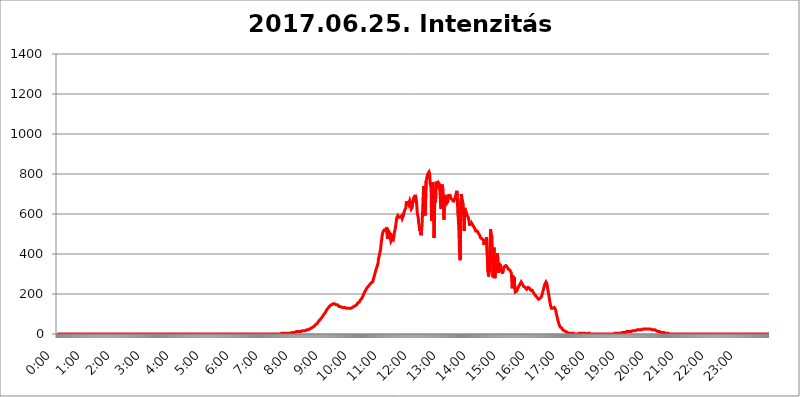
| Category | 2017.06.25. Intenzitás [W/m^2]04 |
|---|---|
| 0.0 | 0 |
| 0.0006944444444444445 | 0 |
| 0.001388888888888889 | 0 |
| 0.0020833333333333333 | 0 |
| 0.002777777777777778 | 0 |
| 0.003472222222222222 | 0 |
| 0.004166666666666667 | 0 |
| 0.004861111111111111 | 0 |
| 0.005555555555555556 | 0 |
| 0.0062499999999999995 | 0 |
| 0.006944444444444444 | 0 |
| 0.007638888888888889 | 0 |
| 0.008333333333333333 | 0 |
| 0.009027777777777779 | 0 |
| 0.009722222222222222 | 0 |
| 0.010416666666666666 | 0 |
| 0.011111111111111112 | 0 |
| 0.011805555555555555 | 0 |
| 0.012499999999999999 | 0 |
| 0.013194444444444444 | 0 |
| 0.013888888888888888 | 0 |
| 0.014583333333333332 | 0 |
| 0.015277777777777777 | 0 |
| 0.015972222222222224 | 0 |
| 0.016666666666666666 | 0 |
| 0.017361111111111112 | 0 |
| 0.018055555555555557 | 0 |
| 0.01875 | 0 |
| 0.019444444444444445 | 0 |
| 0.02013888888888889 | 0 |
| 0.020833333333333332 | 0 |
| 0.02152777777777778 | 0 |
| 0.022222222222222223 | 0 |
| 0.02291666666666667 | 0 |
| 0.02361111111111111 | 0 |
| 0.024305555555555556 | 0 |
| 0.024999999999999998 | 0 |
| 0.025694444444444447 | 0 |
| 0.02638888888888889 | 0 |
| 0.027083333333333334 | 0 |
| 0.027777777777777776 | 0 |
| 0.02847222222222222 | 0 |
| 0.029166666666666664 | 0 |
| 0.029861111111111113 | 0 |
| 0.030555555555555555 | 0 |
| 0.03125 | 0 |
| 0.03194444444444445 | 0 |
| 0.03263888888888889 | 0 |
| 0.03333333333333333 | 0 |
| 0.034027777777777775 | 0 |
| 0.034722222222222224 | 0 |
| 0.035416666666666666 | 0 |
| 0.036111111111111115 | 0 |
| 0.03680555555555556 | 0 |
| 0.0375 | 0 |
| 0.03819444444444444 | 0 |
| 0.03888888888888889 | 0 |
| 0.03958333333333333 | 0 |
| 0.04027777777777778 | 0 |
| 0.04097222222222222 | 0 |
| 0.041666666666666664 | 0 |
| 0.042361111111111106 | 0 |
| 0.04305555555555556 | 0 |
| 0.043750000000000004 | 0 |
| 0.044444444444444446 | 0 |
| 0.04513888888888889 | 0 |
| 0.04583333333333334 | 0 |
| 0.04652777777777778 | 0 |
| 0.04722222222222222 | 0 |
| 0.04791666666666666 | 0 |
| 0.04861111111111111 | 0 |
| 0.049305555555555554 | 0 |
| 0.049999999999999996 | 0 |
| 0.05069444444444445 | 0 |
| 0.051388888888888894 | 0 |
| 0.052083333333333336 | 0 |
| 0.05277777777777778 | 0 |
| 0.05347222222222222 | 0 |
| 0.05416666666666667 | 0 |
| 0.05486111111111111 | 0 |
| 0.05555555555555555 | 0 |
| 0.05625 | 0 |
| 0.05694444444444444 | 0 |
| 0.057638888888888885 | 0 |
| 0.05833333333333333 | 0 |
| 0.05902777777777778 | 0 |
| 0.059722222222222225 | 0 |
| 0.06041666666666667 | 0 |
| 0.061111111111111116 | 0 |
| 0.06180555555555556 | 0 |
| 0.0625 | 0 |
| 0.06319444444444444 | 0 |
| 0.06388888888888888 | 0 |
| 0.06458333333333334 | 0 |
| 0.06527777777777778 | 0 |
| 0.06597222222222222 | 0 |
| 0.06666666666666667 | 0 |
| 0.06736111111111111 | 0 |
| 0.06805555555555555 | 0 |
| 0.06874999999999999 | 0 |
| 0.06944444444444443 | 0 |
| 0.07013888888888889 | 0 |
| 0.07083333333333333 | 0 |
| 0.07152777777777779 | 0 |
| 0.07222222222222223 | 0 |
| 0.07291666666666667 | 0 |
| 0.07361111111111111 | 0 |
| 0.07430555555555556 | 0 |
| 0.075 | 0 |
| 0.07569444444444444 | 0 |
| 0.0763888888888889 | 0 |
| 0.07708333333333334 | 0 |
| 0.07777777777777778 | 0 |
| 0.07847222222222222 | 0 |
| 0.07916666666666666 | 0 |
| 0.0798611111111111 | 0 |
| 0.08055555555555556 | 0 |
| 0.08125 | 0 |
| 0.08194444444444444 | 0 |
| 0.08263888888888889 | 0 |
| 0.08333333333333333 | 0 |
| 0.08402777777777777 | 0 |
| 0.08472222222222221 | 0 |
| 0.08541666666666665 | 0 |
| 0.08611111111111112 | 0 |
| 0.08680555555555557 | 0 |
| 0.08750000000000001 | 0 |
| 0.08819444444444445 | 0 |
| 0.08888888888888889 | 0 |
| 0.08958333333333333 | 0 |
| 0.09027777777777778 | 0 |
| 0.09097222222222222 | 0 |
| 0.09166666666666667 | 0 |
| 0.09236111111111112 | 0 |
| 0.09305555555555556 | 0 |
| 0.09375 | 0 |
| 0.09444444444444444 | 0 |
| 0.09513888888888888 | 0 |
| 0.09583333333333333 | 0 |
| 0.09652777777777777 | 0 |
| 0.09722222222222222 | 0 |
| 0.09791666666666667 | 0 |
| 0.09861111111111111 | 0 |
| 0.09930555555555555 | 0 |
| 0.09999999999999999 | 0 |
| 0.10069444444444443 | 0 |
| 0.1013888888888889 | 0 |
| 0.10208333333333335 | 0 |
| 0.10277777777777779 | 0 |
| 0.10347222222222223 | 0 |
| 0.10416666666666667 | 0 |
| 0.10486111111111111 | 0 |
| 0.10555555555555556 | 0 |
| 0.10625 | 0 |
| 0.10694444444444444 | 0 |
| 0.1076388888888889 | 0 |
| 0.10833333333333334 | 0 |
| 0.10902777777777778 | 0 |
| 0.10972222222222222 | 0 |
| 0.1111111111111111 | 0 |
| 0.11180555555555556 | 0 |
| 0.11180555555555556 | 0 |
| 0.1125 | 0 |
| 0.11319444444444444 | 0 |
| 0.11388888888888889 | 0 |
| 0.11458333333333333 | 0 |
| 0.11527777777777777 | 0 |
| 0.11597222222222221 | 0 |
| 0.11666666666666665 | 0 |
| 0.1173611111111111 | 0 |
| 0.11805555555555557 | 0 |
| 0.11944444444444445 | 0 |
| 0.12013888888888889 | 0 |
| 0.12083333333333333 | 0 |
| 0.12152777777777778 | 0 |
| 0.12222222222222223 | 0 |
| 0.12291666666666667 | 0 |
| 0.12291666666666667 | 0 |
| 0.12361111111111112 | 0 |
| 0.12430555555555556 | 0 |
| 0.125 | 0 |
| 0.12569444444444444 | 0 |
| 0.12638888888888888 | 0 |
| 0.12708333333333333 | 0 |
| 0.16875 | 0 |
| 0.12847222222222224 | 0 |
| 0.12916666666666668 | 0 |
| 0.12986111111111112 | 0 |
| 0.13055555555555556 | 0 |
| 0.13125 | 0 |
| 0.13194444444444445 | 0 |
| 0.1326388888888889 | 0 |
| 0.13333333333333333 | 0 |
| 0.13402777777777777 | 0 |
| 0.13402777777777777 | 0 |
| 0.13472222222222222 | 0 |
| 0.13541666666666666 | 0 |
| 0.1361111111111111 | 0 |
| 0.13749999999999998 | 0 |
| 0.13819444444444443 | 0 |
| 0.1388888888888889 | 0 |
| 0.13958333333333334 | 0 |
| 0.14027777777777778 | 0 |
| 0.14097222222222222 | 0 |
| 0.14166666666666666 | 0 |
| 0.1423611111111111 | 0 |
| 0.14305555555555557 | 0 |
| 0.14375000000000002 | 0 |
| 0.14444444444444446 | 0 |
| 0.1451388888888889 | 0 |
| 0.1451388888888889 | 0 |
| 0.14652777777777778 | 0 |
| 0.14722222222222223 | 0 |
| 0.14791666666666667 | 0 |
| 0.1486111111111111 | 0 |
| 0.14930555555555555 | 0 |
| 0.15 | 0 |
| 0.15069444444444444 | 0 |
| 0.15138888888888888 | 0 |
| 0.15208333333333332 | 0 |
| 0.15277777777777776 | 0 |
| 0.15347222222222223 | 0 |
| 0.15416666666666667 | 0 |
| 0.15486111111111112 | 0 |
| 0.15555555555555556 | 0 |
| 0.15625 | 0 |
| 0.15694444444444444 | 0 |
| 0.15763888888888888 | 0 |
| 0.15833333333333333 | 0 |
| 0.15902777777777777 | 0 |
| 0.15972222222222224 | 0 |
| 0.16041666666666668 | 0 |
| 0.16111111111111112 | 0 |
| 0.16180555555555556 | 0 |
| 0.1625 | 0 |
| 0.16319444444444445 | 0 |
| 0.1638888888888889 | 0 |
| 0.16458333333333333 | 0 |
| 0.16527777777777777 | 0 |
| 0.16597222222222222 | 0 |
| 0.16666666666666666 | 0 |
| 0.1673611111111111 | 0 |
| 0.16805555555555554 | 0 |
| 0.16874999999999998 | 0 |
| 0.16944444444444443 | 0 |
| 0.17013888888888887 | 0 |
| 0.1708333333333333 | 0 |
| 0.17152777777777775 | 0 |
| 0.17222222222222225 | 0 |
| 0.1729166666666667 | 0 |
| 0.17361111111111113 | 0 |
| 0.17430555555555557 | 0 |
| 0.17500000000000002 | 0 |
| 0.17569444444444446 | 0 |
| 0.1763888888888889 | 0 |
| 0.17708333333333334 | 0 |
| 0.17777777777777778 | 0 |
| 0.17847222222222223 | 0 |
| 0.17916666666666667 | 0 |
| 0.1798611111111111 | 0 |
| 0.18055555555555555 | 0 |
| 0.18125 | 0 |
| 0.18194444444444444 | 0 |
| 0.1826388888888889 | 0 |
| 0.18333333333333335 | 0 |
| 0.1840277777777778 | 0 |
| 0.18472222222222223 | 0 |
| 0.18541666666666667 | 0 |
| 0.18611111111111112 | 0 |
| 0.18680555555555556 | 0 |
| 0.1875 | 0 |
| 0.18819444444444444 | 0 |
| 0.18888888888888888 | 0 |
| 0.18958333333333333 | 0 |
| 0.19027777777777777 | 0 |
| 0.1909722222222222 | 0 |
| 0.19166666666666665 | 0 |
| 0.19236111111111112 | 0 |
| 0.19305555555555554 | 0 |
| 0.19375 | 0 |
| 0.19444444444444445 | 0 |
| 0.1951388888888889 | 0 |
| 0.19583333333333333 | 0 |
| 0.19652777777777777 | 0 |
| 0.19722222222222222 | 0 |
| 0.19791666666666666 | 0 |
| 0.1986111111111111 | 0 |
| 0.19930555555555554 | 0 |
| 0.19999999999999998 | 0 |
| 0.20069444444444443 | 0 |
| 0.20138888888888887 | 0 |
| 0.2020833333333333 | 0 |
| 0.2027777777777778 | 0 |
| 0.2034722222222222 | 0 |
| 0.2041666666666667 | 0 |
| 0.20486111111111113 | 0 |
| 0.20555555555555557 | 0 |
| 0.20625000000000002 | 0 |
| 0.20694444444444446 | 0 |
| 0.2076388888888889 | 0 |
| 0.20833333333333334 | 0 |
| 0.20902777777777778 | 0 |
| 0.20972222222222223 | 0 |
| 0.21041666666666667 | 0 |
| 0.2111111111111111 | 0 |
| 0.21180555555555555 | 0 |
| 0.2125 | 0 |
| 0.21319444444444444 | 0 |
| 0.2138888888888889 | 0 |
| 0.21458333333333335 | 0 |
| 0.2152777777777778 | 0 |
| 0.21597222222222223 | 0 |
| 0.21666666666666667 | 0 |
| 0.21736111111111112 | 0 |
| 0.21805555555555556 | 0 |
| 0.21875 | 0 |
| 0.21944444444444444 | 0 |
| 0.22013888888888888 | 0 |
| 0.22083333333333333 | 0 |
| 0.22152777777777777 | 0 |
| 0.2222222222222222 | 0 |
| 0.22291666666666665 | 0 |
| 0.2236111111111111 | 0 |
| 0.22430555555555556 | 0 |
| 0.225 | 0 |
| 0.22569444444444445 | 0 |
| 0.2263888888888889 | 0 |
| 0.22708333333333333 | 0 |
| 0.22777777777777777 | 0 |
| 0.22847222222222222 | 0 |
| 0.22916666666666666 | 0 |
| 0.2298611111111111 | 0 |
| 0.23055555555555554 | 0 |
| 0.23124999999999998 | 0 |
| 0.23194444444444443 | 0 |
| 0.23263888888888887 | 0 |
| 0.2333333333333333 | 0 |
| 0.2340277777777778 | 0 |
| 0.2347222222222222 | 0 |
| 0.2354166666666667 | 0 |
| 0.23611111111111113 | 0 |
| 0.23680555555555557 | 0 |
| 0.23750000000000002 | 0 |
| 0.23819444444444446 | 0 |
| 0.2388888888888889 | 0 |
| 0.23958333333333334 | 0 |
| 0.24027777777777778 | 0 |
| 0.24097222222222223 | 0 |
| 0.24166666666666667 | 0 |
| 0.2423611111111111 | 0 |
| 0.24305555555555555 | 0 |
| 0.24375 | 0 |
| 0.24444444444444446 | 0 |
| 0.24513888888888888 | 0 |
| 0.24583333333333335 | 0 |
| 0.2465277777777778 | 0 |
| 0.24722222222222223 | 0 |
| 0.24791666666666667 | 0 |
| 0.24861111111111112 | 0 |
| 0.24930555555555556 | 0 |
| 0.25 | 0 |
| 0.25069444444444444 | 0 |
| 0.2513888888888889 | 0 |
| 0.2520833333333333 | 0 |
| 0.25277777777777777 | 0 |
| 0.2534722222222222 | 0 |
| 0.25416666666666665 | 0 |
| 0.2548611111111111 | 0 |
| 0.2555555555555556 | 0 |
| 0.25625000000000003 | 0 |
| 0.2569444444444445 | 0 |
| 0.2576388888888889 | 0 |
| 0.25833333333333336 | 0 |
| 0.2590277777777778 | 0 |
| 0.25972222222222224 | 0 |
| 0.2604166666666667 | 0 |
| 0.2611111111111111 | 0 |
| 0.26180555555555557 | 0 |
| 0.2625 | 0 |
| 0.26319444444444445 | 0 |
| 0.2638888888888889 | 0 |
| 0.26458333333333334 | 0 |
| 0.2652777777777778 | 0 |
| 0.2659722222222222 | 0 |
| 0.26666666666666666 | 0 |
| 0.2673611111111111 | 0 |
| 0.26805555555555555 | 0 |
| 0.26875 | 0 |
| 0.26944444444444443 | 0 |
| 0.2701388888888889 | 0 |
| 0.2708333333333333 | 0 |
| 0.27152777777777776 | 0 |
| 0.2722222222222222 | 0 |
| 0.27291666666666664 | 0 |
| 0.2736111111111111 | 0 |
| 0.2743055555555555 | 0 |
| 0.27499999999999997 | 0 |
| 0.27569444444444446 | 0 |
| 0.27638888888888885 | 0 |
| 0.27708333333333335 | 0 |
| 0.2777777777777778 | 0 |
| 0.27847222222222223 | 0 |
| 0.2791666666666667 | 0 |
| 0.2798611111111111 | 0 |
| 0.28055555555555556 | 0 |
| 0.28125 | 0 |
| 0.28194444444444444 | 0 |
| 0.2826388888888889 | 0 |
| 0.2833333333333333 | 0 |
| 0.28402777777777777 | 0 |
| 0.2847222222222222 | 0 |
| 0.28541666666666665 | 0 |
| 0.28611111111111115 | 0 |
| 0.28680555555555554 | 0 |
| 0.28750000000000003 | 0 |
| 0.2881944444444445 | 0 |
| 0.2888888888888889 | 0 |
| 0.28958333333333336 | 0 |
| 0.2902777777777778 | 0 |
| 0.29097222222222224 | 0 |
| 0.2916666666666667 | 0 |
| 0.2923611111111111 | 0 |
| 0.29305555555555557 | 0 |
| 0.29375 | 0 |
| 0.29444444444444445 | 0 |
| 0.2951388888888889 | 0 |
| 0.29583333333333334 | 0 |
| 0.2965277777777778 | 0 |
| 0.2972222222222222 | 0 |
| 0.29791666666666666 | 0 |
| 0.2986111111111111 | 0 |
| 0.29930555555555555 | 0 |
| 0.3 | 0 |
| 0.30069444444444443 | 0 |
| 0.3013888888888889 | 0 |
| 0.3020833333333333 | 0 |
| 0.30277777777777776 | 0 |
| 0.3034722222222222 | 0 |
| 0.30416666666666664 | 0 |
| 0.3048611111111111 | 0 |
| 0.3055555555555555 | 0 |
| 0.30624999999999997 | 0 |
| 0.3069444444444444 | 0 |
| 0.3076388888888889 | 0 |
| 0.30833333333333335 | 0 |
| 0.3090277777777778 | 0 |
| 0.30972222222222223 | 0 |
| 0.3104166666666667 | 0 |
| 0.3111111111111111 | 0 |
| 0.31180555555555556 | 0 |
| 0.3125 | 0 |
| 0.31319444444444444 | 0 |
| 0.3138888888888889 | 0 |
| 0.3145833333333333 | 3.525 |
| 0.31527777777777777 | 3.525 |
| 0.3159722222222222 | 0 |
| 0.31666666666666665 | 3.525 |
| 0.31736111111111115 | 3.525 |
| 0.31805555555555554 | 3.525 |
| 0.31875000000000003 | 3.525 |
| 0.3194444444444445 | 3.525 |
| 0.3201388888888889 | 3.525 |
| 0.32083333333333336 | 3.525 |
| 0.3215277777777778 | 3.525 |
| 0.32222222222222224 | 3.525 |
| 0.3229166666666667 | 3.525 |
| 0.3236111111111111 | 3.525 |
| 0.32430555555555557 | 3.525 |
| 0.325 | 3.525 |
| 0.32569444444444445 | 3.525 |
| 0.3263888888888889 | 3.525 |
| 0.32708333333333334 | 3.525 |
| 0.3277777777777778 | 3.525 |
| 0.3284722222222222 | 3.525 |
| 0.32916666666666666 | 7.887 |
| 0.3298611111111111 | 7.887 |
| 0.33055555555555555 | 7.887 |
| 0.33125 | 7.887 |
| 0.33194444444444443 | 7.887 |
| 0.3326388888888889 | 7.887 |
| 0.3333333333333333 | 7.887 |
| 0.3340277777777778 | 12.257 |
| 0.3347222222222222 | 12.257 |
| 0.3354166666666667 | 12.257 |
| 0.3361111111111111 | 12.257 |
| 0.3368055555555556 | 12.257 |
| 0.33749999999999997 | 12.257 |
| 0.33819444444444446 | 12.257 |
| 0.33888888888888885 | 12.257 |
| 0.33958333333333335 | 12.257 |
| 0.34027777777777773 | 12.257 |
| 0.34097222222222223 | 12.257 |
| 0.3416666666666666 | 12.257 |
| 0.3423611111111111 | 12.257 |
| 0.3430555555555555 | 12.257 |
| 0.34375 | 16.636 |
| 0.3444444444444445 | 16.636 |
| 0.3451388888888889 | 16.636 |
| 0.3458333333333334 | 16.636 |
| 0.34652777777777777 | 16.636 |
| 0.34722222222222227 | 16.636 |
| 0.34791666666666665 | 16.636 |
| 0.34861111111111115 | 16.636 |
| 0.34930555555555554 | 21.024 |
| 0.35000000000000003 | 21.024 |
| 0.3506944444444444 | 21.024 |
| 0.3513888888888889 | 21.024 |
| 0.3520833333333333 | 21.024 |
| 0.3527777777777778 | 21.024 |
| 0.3534722222222222 | 25.419 |
| 0.3541666666666667 | 25.419 |
| 0.3548611111111111 | 25.419 |
| 0.35555555555555557 | 25.419 |
| 0.35625 | 29.823 |
| 0.35694444444444445 | 29.823 |
| 0.3576388888888889 | 29.823 |
| 0.35833333333333334 | 34.234 |
| 0.3590277777777778 | 34.234 |
| 0.3597222222222222 | 38.653 |
| 0.36041666666666666 | 38.653 |
| 0.3611111111111111 | 38.653 |
| 0.36180555555555555 | 43.079 |
| 0.3625 | 47.511 |
| 0.36319444444444443 | 47.511 |
| 0.3638888888888889 | 51.951 |
| 0.3645833333333333 | 51.951 |
| 0.3652777777777778 | 56.398 |
| 0.3659722222222222 | 60.85 |
| 0.3666666666666667 | 65.31 |
| 0.3673611111111111 | 65.31 |
| 0.3680555555555556 | 69.775 |
| 0.36874999999999997 | 74.246 |
| 0.36944444444444446 | 74.246 |
| 0.37013888888888885 | 78.722 |
| 0.37083333333333335 | 83.205 |
| 0.37152777777777773 | 83.205 |
| 0.37222222222222223 | 87.692 |
| 0.3729166666666666 | 92.184 |
| 0.3736111111111111 | 96.682 |
| 0.3743055555555555 | 101.184 |
| 0.375 | 101.184 |
| 0.3756944444444445 | 105.69 |
| 0.3763888888888889 | 110.201 |
| 0.3770833333333334 | 114.716 |
| 0.37777777777777777 | 119.235 |
| 0.37847222222222227 | 123.758 |
| 0.37916666666666665 | 128.284 |
| 0.37986111111111115 | 128.284 |
| 0.38055555555555554 | 132.814 |
| 0.38125000000000003 | 137.347 |
| 0.3819444444444444 | 137.347 |
| 0.3826388888888889 | 141.884 |
| 0.3833333333333333 | 141.884 |
| 0.3840277777777778 | 146.423 |
| 0.3847222222222222 | 146.423 |
| 0.3854166666666667 | 146.423 |
| 0.3861111111111111 | 150.964 |
| 0.38680555555555557 | 150.964 |
| 0.3875 | 150.964 |
| 0.38819444444444445 | 150.964 |
| 0.3888888888888889 | 150.964 |
| 0.38958333333333334 | 150.964 |
| 0.3902777777777778 | 150.964 |
| 0.3909722222222222 | 146.423 |
| 0.39166666666666666 | 146.423 |
| 0.3923611111111111 | 146.423 |
| 0.39305555555555555 | 146.423 |
| 0.39375 | 141.884 |
| 0.39444444444444443 | 141.884 |
| 0.3951388888888889 | 137.347 |
| 0.3958333333333333 | 137.347 |
| 0.3965277777777778 | 137.347 |
| 0.3972222222222222 | 137.347 |
| 0.3979166666666667 | 132.814 |
| 0.3986111111111111 | 132.814 |
| 0.3993055555555556 | 132.814 |
| 0.39999999999999997 | 132.814 |
| 0.40069444444444446 | 132.814 |
| 0.40138888888888885 | 132.814 |
| 0.40208333333333335 | 132.814 |
| 0.40277777777777773 | 132.814 |
| 0.40347222222222223 | 132.814 |
| 0.4041666666666666 | 128.284 |
| 0.4048611111111111 | 128.284 |
| 0.4055555555555555 | 128.284 |
| 0.40625 | 128.284 |
| 0.4069444444444445 | 128.284 |
| 0.4076388888888889 | 128.284 |
| 0.4083333333333334 | 128.284 |
| 0.40902777777777777 | 128.284 |
| 0.40972222222222227 | 128.284 |
| 0.41041666666666665 | 128.284 |
| 0.41111111111111115 | 128.284 |
| 0.41180555555555554 | 128.284 |
| 0.41250000000000003 | 132.814 |
| 0.4131944444444444 | 132.814 |
| 0.4138888888888889 | 132.814 |
| 0.4145833333333333 | 132.814 |
| 0.4152777777777778 | 137.347 |
| 0.4159722222222222 | 137.347 |
| 0.4166666666666667 | 137.347 |
| 0.4173611111111111 | 141.884 |
| 0.41805555555555557 | 141.884 |
| 0.41875 | 146.423 |
| 0.41944444444444445 | 146.423 |
| 0.4201388888888889 | 146.423 |
| 0.42083333333333334 | 150.964 |
| 0.4215277777777778 | 155.509 |
| 0.4222222222222222 | 155.509 |
| 0.42291666666666666 | 160.056 |
| 0.4236111111111111 | 160.056 |
| 0.42430555555555555 | 164.605 |
| 0.425 | 169.156 |
| 0.42569444444444443 | 173.709 |
| 0.4263888888888889 | 173.709 |
| 0.4270833333333333 | 178.264 |
| 0.4277777777777778 | 182.82 |
| 0.4284722222222222 | 187.378 |
| 0.4291666666666667 | 191.937 |
| 0.4298611111111111 | 201.058 |
| 0.4305555555555556 | 201.058 |
| 0.43124999999999997 | 210.182 |
| 0.43194444444444446 | 214.746 |
| 0.43263888888888885 | 219.309 |
| 0.43333333333333335 | 223.873 |
| 0.43402777777777773 | 228.436 |
| 0.43472222222222223 | 233 |
| 0.4354166666666666 | 233 |
| 0.4361111111111111 | 237.564 |
| 0.4368055555555555 | 242.127 |
| 0.4375 | 242.127 |
| 0.4381944444444445 | 246.689 |
| 0.4388888888888889 | 251.251 |
| 0.4395833333333334 | 251.251 |
| 0.44027777777777777 | 255.813 |
| 0.44097222222222227 | 255.813 |
| 0.44166666666666665 | 255.813 |
| 0.44236111111111115 | 260.373 |
| 0.44305555555555554 | 269.49 |
| 0.44375000000000003 | 278.603 |
| 0.4444444444444444 | 287.709 |
| 0.4451388888888889 | 296.808 |
| 0.4458333333333333 | 305.898 |
| 0.4465277777777778 | 314.98 |
| 0.4472222222222222 | 324.052 |
| 0.4479166666666667 | 328.584 |
| 0.4486111111111111 | 337.639 |
| 0.44930555555555557 | 342.162 |
| 0.45 | 355.712 |
| 0.45069444444444445 | 378.224 |
| 0.4513888888888889 | 387.202 |
| 0.45208333333333334 | 400.638 |
| 0.4527777777777778 | 405.108 |
| 0.4534722222222222 | 422.943 |
| 0.45416666666666666 | 449.551 |
| 0.4548611111111111 | 467.187 |
| 0.45555555555555555 | 489.108 |
| 0.45625 | 502.192 |
| 0.45694444444444443 | 510.885 |
| 0.4576388888888889 | 515.223 |
| 0.4583333333333333 | 519.555 |
| 0.4590277777777778 | 523.88 |
| 0.4597222222222222 | 519.555 |
| 0.4604166666666667 | 519.555 |
| 0.4611111111111111 | 523.88 |
| 0.4618055555555556 | 532.513 |
| 0.46249999999999997 | 502.192 |
| 0.46319444444444446 | 475.972 |
| 0.46388888888888885 | 489.108 |
| 0.46458333333333335 | 515.223 |
| 0.46527777777777773 | 510.885 |
| 0.46597222222222223 | 510.885 |
| 0.4666666666666666 | 502.192 |
| 0.4673611111111111 | 475.972 |
| 0.4680555555555555 | 462.786 |
| 0.46875 | 467.187 |
| 0.4694444444444445 | 471.582 |
| 0.4701388888888889 | 484.735 |
| 0.4708333333333334 | 480.356 |
| 0.47152777777777777 | 475.972 |
| 0.47222222222222227 | 489.108 |
| 0.47291666666666665 | 510.885 |
| 0.47361111111111115 | 519.555 |
| 0.47430555555555554 | 532.513 |
| 0.47500000000000003 | 549.704 |
| 0.4756944444444444 | 566.793 |
| 0.4763888888888889 | 583.779 |
| 0.4770833333333333 | 588.009 |
| 0.4777777777777778 | 592.233 |
| 0.4784722222222222 | 588.009 |
| 0.4791666666666667 | 583.779 |
| 0.4798611111111111 | 588.009 |
| 0.48055555555555557 | 588.009 |
| 0.48125 | 583.779 |
| 0.48194444444444445 | 583.779 |
| 0.4826388888888889 | 588.009 |
| 0.48333333333333334 | 592.233 |
| 0.4840277777777778 | 579.542 |
| 0.4847222222222222 | 583.779 |
| 0.48541666666666666 | 592.233 |
| 0.4861111111111111 | 604.864 |
| 0.48680555555555555 | 604.864 |
| 0.4875 | 621.613 |
| 0.48819444444444443 | 625.784 |
| 0.4888888888888889 | 629.948 |
| 0.4895833333333333 | 663.019 |
| 0.4902777777777778 | 650.667 |
| 0.4909722222222222 | 646.537 |
| 0.4916666666666667 | 650.667 |
| 0.4923611111111111 | 658.909 |
| 0.4930555555555556 | 650.667 |
| 0.49374999999999997 | 658.909 |
| 0.49444444444444446 | 667.123 |
| 0.49513888888888885 | 658.909 |
| 0.49583333333333335 | 638.256 |
| 0.49652777777777773 | 625.784 |
| 0.49722222222222223 | 625.784 |
| 0.4979166666666666 | 634.105 |
| 0.4986111111111111 | 658.909 |
| 0.4993055555555555 | 667.123 |
| 0.5 | 658.909 |
| 0.5006944444444444 | 687.544 |
| 0.5013888888888889 | 679.395 |
| 0.5020833333333333 | 695.666 |
| 0.5027777777777778 | 687.544 |
| 0.5034722222222222 | 675.311 |
| 0.5041666666666667 | 646.537 |
| 0.5048611111111111 | 609.062 |
| 0.5055555555555555 | 592.233 |
| 0.50625 | 583.779 |
| 0.5069444444444444 | 553.986 |
| 0.5076388888888889 | 545.416 |
| 0.5083333333333333 | 515.223 |
| 0.5090277777777777 | 532.513 |
| 0.5097222222222222 | 502.192 |
| 0.5104166666666666 | 493.475 |
| 0.5111111111111112 | 523.88 |
| 0.5118055555555555 | 558.261 |
| 0.5125000000000001 | 617.436 |
| 0.5131944444444444 | 687.544 |
| 0.513888888888889 | 739.877 |
| 0.5145833333333333 | 735.89 |
| 0.5152777777777778 | 683.473 |
| 0.5159722222222222 | 592.233 |
| 0.5166666666666667 | 592.233 |
| 0.517361111111111 | 763.674 |
| 0.5180555555555556 | 775.492 |
| 0.5187499999999999 | 779.42 |
| 0.5194444444444445 | 798.974 |
| 0.5201388888888888 | 798.974 |
| 0.5208333333333334 | 798.974 |
| 0.5215277777777778 | 810.641 |
| 0.5222222222222223 | 802.868 |
| 0.5229166666666667 | 751.803 |
| 0.5236111111111111 | 743.859 |
| 0.5243055555555556 | 727.896 |
| 0.525 | 566.793 |
| 0.5256944444444445 | 629.948 |
| 0.5263888888888889 | 759.723 |
| 0.5270833333333333 | 723.889 |
| 0.5277777777777778 | 727.896 |
| 0.5284722222222222 | 480.356 |
| 0.5291666666666667 | 613.252 |
| 0.5298611111111111 | 731.896 |
| 0.5305555555555556 | 658.909 |
| 0.53125 | 755.766 |
| 0.5319444444444444 | 755.766 |
| 0.5326388888888889 | 759.723 |
| 0.5333333333333333 | 755.766 |
| 0.5340277777777778 | 747.834 |
| 0.5347222222222222 | 755.766 |
| 0.5354166666666667 | 751.803 |
| 0.5361111111111111 | 747.834 |
| 0.5368055555555555 | 747.834 |
| 0.5375 | 751.803 |
| 0.5381944444444444 | 625.784 |
| 0.5388888888888889 | 703.762 |
| 0.5395833333333333 | 747.834 |
| 0.5402777777777777 | 743.859 |
| 0.5409722222222222 | 723.889 |
| 0.5416666666666666 | 663.019 |
| 0.5423611111111112 | 571.049 |
| 0.5430555555555555 | 675.311 |
| 0.5437500000000001 | 695.666 |
| 0.5444444444444444 | 663.019 |
| 0.545138888888889 | 671.22 |
| 0.5458333333333333 | 667.123 |
| 0.5465277777777778 | 654.791 |
| 0.5472222222222222 | 658.909 |
| 0.5479166666666667 | 663.019 |
| 0.548611111111111 | 683.473 |
| 0.5493055555555556 | 699.717 |
| 0.5499999999999999 | 687.544 |
| 0.5506944444444445 | 695.666 |
| 0.5513888888888888 | 683.473 |
| 0.5520833333333334 | 687.544 |
| 0.5527777777777778 | 675.311 |
| 0.5534722222222223 | 679.395 |
| 0.5541666666666667 | 679.395 |
| 0.5548611111111111 | 671.22 |
| 0.5555555555555556 | 658.909 |
| 0.55625 | 667.123 |
| 0.5569444444444445 | 667.123 |
| 0.5576388888888889 | 675.311 |
| 0.5583333333333333 | 679.395 |
| 0.5590277777777778 | 695.666 |
| 0.5597222222222222 | 699.717 |
| 0.5604166666666667 | 715.858 |
| 0.5611111111111111 | 687.544 |
| 0.5618055555555556 | 604.864 |
| 0.5625 | 575.299 |
| 0.5631944444444444 | 532.513 |
| 0.5638888888888889 | 449.551 |
| 0.5645833333333333 | 378.224 |
| 0.5652777777777778 | 369.23 |
| 0.5659722222222222 | 663.019 |
| 0.5666666666666667 | 699.717 |
| 0.5673611111111111 | 683.473 |
| 0.5680555555555555 | 671.22 |
| 0.56875 | 671.22 |
| 0.5694444444444444 | 646.537 |
| 0.5701388888888889 | 650.667 |
| 0.5708333333333333 | 515.223 |
| 0.5715277777777777 | 629.948 |
| 0.5722222222222222 | 621.613 |
| 0.5729166666666666 | 617.436 |
| 0.5736111111111112 | 609.062 |
| 0.5743055555555555 | 600.661 |
| 0.5750000000000001 | 592.233 |
| 0.5756944444444444 | 588.009 |
| 0.576388888888889 | 583.779 |
| 0.5770833333333333 | 579.542 |
| 0.5777777777777778 | 558.261 |
| 0.5784722222222222 | 541.121 |
| 0.5791666666666667 | 541.121 |
| 0.579861111111111 | 558.261 |
| 0.5805555555555556 | 545.416 |
| 0.5812499999999999 | 553.986 |
| 0.5819444444444445 | 553.986 |
| 0.5826388888888888 | 549.704 |
| 0.5833333333333334 | 541.121 |
| 0.5840277777777778 | 536.82 |
| 0.5847222222222223 | 532.513 |
| 0.5854166666666667 | 532.513 |
| 0.5861111111111111 | 523.88 |
| 0.5868055555555556 | 515.223 |
| 0.5875 | 510.885 |
| 0.5881944444444445 | 515.223 |
| 0.5888888888888889 | 515.223 |
| 0.5895833333333333 | 510.885 |
| 0.5902777777777778 | 506.542 |
| 0.5909722222222222 | 502.192 |
| 0.5916666666666667 | 497.836 |
| 0.5923611111111111 | 493.475 |
| 0.5930555555555556 | 489.108 |
| 0.59375 | 480.356 |
| 0.5944444444444444 | 480.356 |
| 0.5951388888888889 | 480.356 |
| 0.5958333333333333 | 475.972 |
| 0.5965277777777778 | 471.582 |
| 0.5972222222222222 | 471.582 |
| 0.5979166666666667 | 467.187 |
| 0.5986111111111111 | 445.129 |
| 0.5993055555555555 | 467.187 |
| 0.6 | 467.187 |
| 0.6006944444444444 | 471.582 |
| 0.6013888888888889 | 471.582 |
| 0.6020833333333333 | 484.735 |
| 0.6027777777777777 | 489.108 |
| 0.6034722222222222 | 489.108 |
| 0.6041666666666666 | 310.44 |
| 0.6048611111111112 | 287.709 |
| 0.6055555555555555 | 305.898 |
| 0.6062500000000001 | 301.354 |
| 0.6069444444444444 | 319.517 |
| 0.607638888888889 | 523.88 |
| 0.6083333333333333 | 506.542 |
| 0.6090277777777778 | 493.475 |
| 0.6097222222222222 | 484.735 |
| 0.6104166666666667 | 378.224 |
| 0.611111111111111 | 283.156 |
| 0.6118055555555556 | 278.603 |
| 0.6124999999999999 | 431.833 |
| 0.6131944444444445 | 292.259 |
| 0.6138888888888888 | 278.603 |
| 0.6145833333333334 | 319.517 |
| 0.6152777777777778 | 355.712 |
| 0.6159722222222223 | 387.202 |
| 0.6166666666666667 | 355.712 |
| 0.6173611111111111 | 405.108 |
| 0.6180555555555556 | 360.221 |
| 0.61875 | 305.898 |
| 0.6194444444444445 | 355.712 |
| 0.6201388888888889 | 351.198 |
| 0.6208333333333333 | 310.44 |
| 0.6215277777777778 | 346.682 |
| 0.6222222222222222 | 328.584 |
| 0.6229166666666667 | 324.052 |
| 0.6236111111111111 | 310.44 |
| 0.6243055555555556 | 301.354 |
| 0.625 | 305.898 |
| 0.6256944444444444 | 324.052 |
| 0.6263888888888889 | 324.052 |
| 0.6270833333333333 | 337.639 |
| 0.6277777777777778 | 337.639 |
| 0.6284722222222222 | 342.162 |
| 0.6291666666666667 | 342.162 |
| 0.6298611111111111 | 337.639 |
| 0.6305555555555555 | 337.639 |
| 0.63125 | 333.113 |
| 0.6319444444444444 | 328.584 |
| 0.6326388888888889 | 324.052 |
| 0.6333333333333333 | 319.517 |
| 0.6340277777777777 | 319.517 |
| 0.6347222222222222 | 319.517 |
| 0.6354166666666666 | 319.517 |
| 0.6361111111111112 | 314.98 |
| 0.6368055555555555 | 305.898 |
| 0.6375000000000001 | 305.898 |
| 0.6381944444444444 | 228.436 |
| 0.638888888888889 | 292.259 |
| 0.6395833333333333 | 296.808 |
| 0.6402777777777778 | 260.373 |
| 0.6409722222222222 | 283.156 |
| 0.6416666666666667 | 228.436 |
| 0.642361111111111 | 210.182 |
| 0.6430555555555556 | 210.182 |
| 0.6437499999999999 | 205.62 |
| 0.6444444444444445 | 214.746 |
| 0.6451388888888888 | 219.309 |
| 0.6458333333333334 | 228.436 |
| 0.6465277777777778 | 228.436 |
| 0.6472222222222223 | 233 |
| 0.6479166666666667 | 242.127 |
| 0.6486111111111111 | 246.689 |
| 0.6493055555555556 | 251.251 |
| 0.65 | 251.251 |
| 0.6506944444444445 | 260.373 |
| 0.6513888888888889 | 260.373 |
| 0.6520833333333333 | 255.813 |
| 0.6527777777777778 | 246.689 |
| 0.6534722222222222 | 242.127 |
| 0.6541666666666667 | 237.564 |
| 0.6548611111111111 | 237.564 |
| 0.6555555555555556 | 237.564 |
| 0.65625 | 233 |
| 0.6569444444444444 | 228.436 |
| 0.6576388888888889 | 228.436 |
| 0.6583333333333333 | 223.873 |
| 0.6590277777777778 | 228.436 |
| 0.6597222222222222 | 228.436 |
| 0.6604166666666667 | 233 |
| 0.6611111111111111 | 233 |
| 0.6618055555555555 | 233 |
| 0.6625 | 228.436 |
| 0.6631944444444444 | 223.873 |
| 0.6638888888888889 | 219.309 |
| 0.6645833333333333 | 219.309 |
| 0.6652777777777777 | 219.309 |
| 0.6659722222222222 | 219.309 |
| 0.6666666666666666 | 214.746 |
| 0.6673611111111111 | 210.182 |
| 0.6680555555555556 | 205.62 |
| 0.6687500000000001 | 201.058 |
| 0.6694444444444444 | 196.497 |
| 0.6701388888888888 | 196.497 |
| 0.6708333333333334 | 191.937 |
| 0.6715277777777778 | 191.937 |
| 0.6722222222222222 | 187.378 |
| 0.6729166666666666 | 182.82 |
| 0.6736111111111112 | 182.82 |
| 0.6743055555555556 | 178.264 |
| 0.6749999999999999 | 173.709 |
| 0.6756944444444444 | 173.709 |
| 0.6763888888888889 | 173.709 |
| 0.6770833333333334 | 178.264 |
| 0.6777777777777777 | 182.82 |
| 0.6784722222222223 | 182.82 |
| 0.6791666666666667 | 187.378 |
| 0.6798611111111111 | 191.937 |
| 0.6805555555555555 | 205.62 |
| 0.68125 | 214.746 |
| 0.6819444444444445 | 223.873 |
| 0.6826388888888889 | 233 |
| 0.6833333333333332 | 242.127 |
| 0.6840277777777778 | 251.251 |
| 0.6847222222222222 | 251.251 |
| 0.6854166666666667 | 260.373 |
| 0.686111111111111 | 260.373 |
| 0.6868055555555556 | 251.251 |
| 0.6875 | 233 |
| 0.6881944444444444 | 219.309 |
| 0.688888888888889 | 205.62 |
| 0.6895833333333333 | 191.937 |
| 0.6902777777777778 | 173.709 |
| 0.6909722222222222 | 160.056 |
| 0.6916666666666668 | 146.423 |
| 0.6923611111111111 | 137.347 |
| 0.6930555555555555 | 128.284 |
| 0.69375 | 128.284 |
| 0.6944444444444445 | 128.284 |
| 0.6951388888888889 | 128.284 |
| 0.6958333333333333 | 132.814 |
| 0.6965277777777777 | 132.814 |
| 0.6972222222222223 | 132.814 |
| 0.6979166666666666 | 128.284 |
| 0.6986111111111111 | 123.758 |
| 0.6993055555555556 | 114.716 |
| 0.7000000000000001 | 101.184 |
| 0.7006944444444444 | 92.184 |
| 0.7013888888888888 | 78.722 |
| 0.7020833333333334 | 69.775 |
| 0.7027777777777778 | 60.85 |
| 0.7034722222222222 | 51.951 |
| 0.7041666666666666 | 43.079 |
| 0.7048611111111112 | 38.653 |
| 0.7055555555555556 | 34.234 |
| 0.7062499999999999 | 29.823 |
| 0.7069444444444444 | 29.823 |
| 0.7076388888888889 | 29.823 |
| 0.7083333333333334 | 25.419 |
| 0.7090277777777777 | 21.024 |
| 0.7097222222222223 | 21.024 |
| 0.7104166666666667 | 21.024 |
| 0.7111111111111111 | 16.636 |
| 0.7118055555555555 | 16.636 |
| 0.7125 | 12.257 |
| 0.7131944444444445 | 12.257 |
| 0.7138888888888889 | 12.257 |
| 0.7145833333333332 | 7.887 |
| 0.7152777777777778 | 7.887 |
| 0.7159722222222222 | 3.525 |
| 0.7166666666666667 | 3.525 |
| 0.717361111111111 | 3.525 |
| 0.7180555555555556 | 3.525 |
| 0.71875 | 3.525 |
| 0.7194444444444444 | 3.525 |
| 0.720138888888889 | 3.525 |
| 0.7208333333333333 | 3.525 |
| 0.7215277777777778 | 3.525 |
| 0.7222222222222222 | 3.525 |
| 0.7229166666666668 | 0 |
| 0.7236111111111111 | 3.525 |
| 0.7243055555555555 | 0 |
| 0.725 | 0 |
| 0.7256944444444445 | 0 |
| 0.7263888888888889 | 0 |
| 0.7270833333333333 | 0 |
| 0.7277777777777777 | 0 |
| 0.7284722222222223 | 0 |
| 0.7291666666666666 | 0 |
| 0.7298611111111111 | 0 |
| 0.7305555555555556 | 3.525 |
| 0.7312500000000001 | 0 |
| 0.7319444444444444 | 3.525 |
| 0.7326388888888888 | 3.525 |
| 0.7333333333333334 | 3.525 |
| 0.7340277777777778 | 3.525 |
| 0.7347222222222222 | 3.525 |
| 0.7354166666666666 | 3.525 |
| 0.7361111111111112 | 3.525 |
| 0.7368055555555556 | 3.525 |
| 0.7374999999999999 | 3.525 |
| 0.7381944444444444 | 3.525 |
| 0.7388888888888889 | 3.525 |
| 0.7395833333333334 | 3.525 |
| 0.7402777777777777 | 3.525 |
| 0.7409722222222223 | 3.525 |
| 0.7416666666666667 | 3.525 |
| 0.7423611111111111 | 0 |
| 0.7430555555555555 | 3.525 |
| 0.74375 | 0 |
| 0.7444444444444445 | 3.525 |
| 0.7451388888888889 | 0 |
| 0.7458333333333332 | 0 |
| 0.7465277777777778 | 3.525 |
| 0.7472222222222222 | 0 |
| 0.7479166666666667 | 0 |
| 0.748611111111111 | 0 |
| 0.7493055555555556 | 0 |
| 0.75 | 0 |
| 0.7506944444444444 | 0 |
| 0.751388888888889 | 0 |
| 0.7520833333333333 | 0 |
| 0.7527777777777778 | 0 |
| 0.7534722222222222 | 0 |
| 0.7541666666666668 | 0 |
| 0.7548611111111111 | 0 |
| 0.7555555555555555 | 0 |
| 0.75625 | 0 |
| 0.7569444444444445 | 0 |
| 0.7576388888888889 | 0 |
| 0.7583333333333333 | 0 |
| 0.7590277777777777 | 0 |
| 0.7597222222222223 | 0 |
| 0.7604166666666666 | 0 |
| 0.7611111111111111 | 0 |
| 0.7618055555555556 | 0 |
| 0.7625000000000001 | 0 |
| 0.7631944444444444 | 0 |
| 0.7638888888888888 | 0 |
| 0.7645833333333334 | 0 |
| 0.7652777777777778 | 0 |
| 0.7659722222222222 | 0 |
| 0.7666666666666666 | 0 |
| 0.7673611111111112 | 0 |
| 0.7680555555555556 | 0 |
| 0.7687499999999999 | 0 |
| 0.7694444444444444 | 0 |
| 0.7701388888888889 | 0 |
| 0.7708333333333334 | 0 |
| 0.7715277777777777 | 0 |
| 0.7722222222222223 | 0 |
| 0.7729166666666667 | 0 |
| 0.7736111111111111 | 0 |
| 0.7743055555555555 | 0 |
| 0.775 | 0 |
| 0.7756944444444445 | 0 |
| 0.7763888888888889 | 0 |
| 0.7770833333333332 | 0 |
| 0.7777777777777778 | 0 |
| 0.7784722222222222 | 0 |
| 0.7791666666666667 | 0 |
| 0.779861111111111 | 0 |
| 0.7805555555555556 | 0 |
| 0.78125 | 0 |
| 0.7819444444444444 | 3.525 |
| 0.782638888888889 | 3.525 |
| 0.7833333333333333 | 0 |
| 0.7840277777777778 | 3.525 |
| 0.7847222222222222 | 3.525 |
| 0.7854166666666668 | 3.525 |
| 0.7861111111111111 | 3.525 |
| 0.7868055555555555 | 3.525 |
| 0.7875 | 3.525 |
| 0.7881944444444445 | 3.525 |
| 0.7888888888888889 | 3.525 |
| 0.7895833333333333 | 3.525 |
| 0.7902777777777777 | 3.525 |
| 0.7909722222222223 | 3.525 |
| 0.7916666666666666 | 3.525 |
| 0.7923611111111111 | 7.887 |
| 0.7930555555555556 | 7.887 |
| 0.7937500000000001 | 7.887 |
| 0.7944444444444444 | 7.887 |
| 0.7951388888888888 | 7.887 |
| 0.7958333333333334 | 7.887 |
| 0.7965277777777778 | 7.887 |
| 0.7972222222222222 | 12.257 |
| 0.7979166666666666 | 12.257 |
| 0.7986111111111112 | 12.257 |
| 0.7993055555555556 | 12.257 |
| 0.7999999999999999 | 12.257 |
| 0.8006944444444444 | 12.257 |
| 0.8013888888888889 | 12.257 |
| 0.8020833333333334 | 12.257 |
| 0.8027777777777777 | 12.257 |
| 0.8034722222222223 | 12.257 |
| 0.8041666666666667 | 12.257 |
| 0.8048611111111111 | 12.257 |
| 0.8055555555555555 | 16.636 |
| 0.80625 | 16.636 |
| 0.8069444444444445 | 16.636 |
| 0.8076388888888889 | 16.636 |
| 0.8083333333333332 | 16.636 |
| 0.8090277777777778 | 16.636 |
| 0.8097222222222222 | 16.636 |
| 0.8104166666666667 | 16.636 |
| 0.811111111111111 | 16.636 |
| 0.8118055555555556 | 16.636 |
| 0.8125 | 16.636 |
| 0.8131944444444444 | 21.024 |
| 0.813888888888889 | 21.024 |
| 0.8145833333333333 | 21.024 |
| 0.8152777777777778 | 21.024 |
| 0.8159722222222222 | 21.024 |
| 0.8166666666666668 | 21.024 |
| 0.8173611111111111 | 21.024 |
| 0.8180555555555555 | 21.024 |
| 0.81875 | 21.024 |
| 0.8194444444444445 | 21.024 |
| 0.8201388888888889 | 25.419 |
| 0.8208333333333333 | 25.419 |
| 0.8215277777777777 | 25.419 |
| 0.8222222222222223 | 25.419 |
| 0.8229166666666666 | 25.419 |
| 0.8236111111111111 | 25.419 |
| 0.8243055555555556 | 25.419 |
| 0.8250000000000001 | 25.419 |
| 0.8256944444444444 | 25.419 |
| 0.8263888888888888 | 25.419 |
| 0.8270833333333334 | 25.419 |
| 0.8277777777777778 | 25.419 |
| 0.8284722222222222 | 25.419 |
| 0.8291666666666666 | 25.419 |
| 0.8298611111111112 | 25.419 |
| 0.8305555555555556 | 25.419 |
| 0.8312499999999999 | 25.419 |
| 0.8319444444444444 | 25.419 |
| 0.8326388888888889 | 25.419 |
| 0.8333333333333334 | 25.419 |
| 0.8340277777777777 | 21.024 |
| 0.8347222222222223 | 21.024 |
| 0.8354166666666667 | 21.024 |
| 0.8361111111111111 | 21.024 |
| 0.8368055555555555 | 21.024 |
| 0.8375 | 21.024 |
| 0.8381944444444445 | 21.024 |
| 0.8388888888888889 | 16.636 |
| 0.8395833333333332 | 16.636 |
| 0.8402777777777778 | 16.636 |
| 0.8409722222222222 | 16.636 |
| 0.8416666666666667 | 12.257 |
| 0.842361111111111 | 12.257 |
| 0.8430555555555556 | 12.257 |
| 0.84375 | 12.257 |
| 0.8444444444444444 | 12.257 |
| 0.845138888888889 | 12.257 |
| 0.8458333333333333 | 12.257 |
| 0.8465277777777778 | 7.887 |
| 0.8472222222222222 | 7.887 |
| 0.8479166666666668 | 7.887 |
| 0.8486111111111111 | 7.887 |
| 0.8493055555555555 | 7.887 |
| 0.85 | 7.887 |
| 0.8506944444444445 | 7.887 |
| 0.8513888888888889 | 3.525 |
| 0.8520833333333333 | 3.525 |
| 0.8527777777777777 | 3.525 |
| 0.8534722222222223 | 3.525 |
| 0.8541666666666666 | 3.525 |
| 0.8548611111111111 | 3.525 |
| 0.8555555555555556 | 3.525 |
| 0.8562500000000001 | 3.525 |
| 0.8569444444444444 | 3.525 |
| 0.8576388888888888 | 3.525 |
| 0.8583333333333334 | 3.525 |
| 0.8590277777777778 | 0 |
| 0.8597222222222222 | 0 |
| 0.8604166666666666 | 0 |
| 0.8611111111111112 | 0 |
| 0.8618055555555556 | 0 |
| 0.8624999999999999 | 0 |
| 0.8631944444444444 | 0 |
| 0.8638888888888889 | 0 |
| 0.8645833333333334 | 0 |
| 0.8652777777777777 | 0 |
| 0.8659722222222223 | 0 |
| 0.8666666666666667 | 0 |
| 0.8673611111111111 | 0 |
| 0.8680555555555555 | 0 |
| 0.86875 | 0 |
| 0.8694444444444445 | 0 |
| 0.8701388888888889 | 0 |
| 0.8708333333333332 | 0 |
| 0.8715277777777778 | 0 |
| 0.8722222222222222 | 0 |
| 0.8729166666666667 | 0 |
| 0.873611111111111 | 0 |
| 0.8743055555555556 | 0 |
| 0.875 | 0 |
| 0.8756944444444444 | 0 |
| 0.876388888888889 | 0 |
| 0.8770833333333333 | 0 |
| 0.8777777777777778 | 0 |
| 0.8784722222222222 | 0 |
| 0.8791666666666668 | 0 |
| 0.8798611111111111 | 0 |
| 0.8805555555555555 | 0 |
| 0.88125 | 0 |
| 0.8819444444444445 | 0 |
| 0.8826388888888889 | 0 |
| 0.8833333333333333 | 0 |
| 0.8840277777777777 | 0 |
| 0.8847222222222223 | 0 |
| 0.8854166666666666 | 0 |
| 0.8861111111111111 | 0 |
| 0.8868055555555556 | 0 |
| 0.8875000000000001 | 0 |
| 0.8881944444444444 | 0 |
| 0.8888888888888888 | 0 |
| 0.8895833333333334 | 0 |
| 0.8902777777777778 | 0 |
| 0.8909722222222222 | 0 |
| 0.8916666666666666 | 0 |
| 0.8923611111111112 | 0 |
| 0.8930555555555556 | 0 |
| 0.8937499999999999 | 0 |
| 0.8944444444444444 | 0 |
| 0.8951388888888889 | 0 |
| 0.8958333333333334 | 0 |
| 0.8965277777777777 | 0 |
| 0.8972222222222223 | 0 |
| 0.8979166666666667 | 0 |
| 0.8986111111111111 | 0 |
| 0.8993055555555555 | 0 |
| 0.9 | 0 |
| 0.9006944444444445 | 0 |
| 0.9013888888888889 | 0 |
| 0.9020833333333332 | 0 |
| 0.9027777777777778 | 0 |
| 0.9034722222222222 | 0 |
| 0.9041666666666667 | 0 |
| 0.904861111111111 | 0 |
| 0.9055555555555556 | 0 |
| 0.90625 | 0 |
| 0.9069444444444444 | 0 |
| 0.907638888888889 | 0 |
| 0.9083333333333333 | 0 |
| 0.9090277777777778 | 0 |
| 0.9097222222222222 | 0 |
| 0.9104166666666668 | 0 |
| 0.9111111111111111 | 0 |
| 0.9118055555555555 | 0 |
| 0.9125 | 0 |
| 0.9131944444444445 | 0 |
| 0.9138888888888889 | 0 |
| 0.9145833333333333 | 0 |
| 0.9152777777777777 | 0 |
| 0.9159722222222223 | 0 |
| 0.9166666666666666 | 0 |
| 0.9173611111111111 | 0 |
| 0.9180555555555556 | 0 |
| 0.9187500000000001 | 0 |
| 0.9194444444444444 | 0 |
| 0.9201388888888888 | 0 |
| 0.9208333333333334 | 0 |
| 0.9215277777777778 | 0 |
| 0.9222222222222222 | 0 |
| 0.9229166666666666 | 0 |
| 0.9236111111111112 | 0 |
| 0.9243055555555556 | 0 |
| 0.9249999999999999 | 0 |
| 0.9256944444444444 | 0 |
| 0.9263888888888889 | 0 |
| 0.9270833333333334 | 0 |
| 0.9277777777777777 | 0 |
| 0.9284722222222223 | 0 |
| 0.9291666666666667 | 0 |
| 0.9298611111111111 | 0 |
| 0.9305555555555555 | 0 |
| 0.93125 | 0 |
| 0.9319444444444445 | 0 |
| 0.9326388888888889 | 0 |
| 0.9333333333333332 | 0 |
| 0.9340277777777778 | 0 |
| 0.9347222222222222 | 0 |
| 0.9354166666666667 | 0 |
| 0.936111111111111 | 0 |
| 0.9368055555555556 | 0 |
| 0.9375 | 0 |
| 0.9381944444444444 | 0 |
| 0.938888888888889 | 0 |
| 0.9395833333333333 | 0 |
| 0.9402777777777778 | 0 |
| 0.9409722222222222 | 0 |
| 0.9416666666666668 | 0 |
| 0.9423611111111111 | 0 |
| 0.9430555555555555 | 0 |
| 0.94375 | 0 |
| 0.9444444444444445 | 0 |
| 0.9451388888888889 | 0 |
| 0.9458333333333333 | 0 |
| 0.9465277777777777 | 0 |
| 0.9472222222222223 | 0 |
| 0.9479166666666666 | 0 |
| 0.9486111111111111 | 0 |
| 0.9493055555555556 | 0 |
| 0.9500000000000001 | 0 |
| 0.9506944444444444 | 0 |
| 0.9513888888888888 | 0 |
| 0.9520833333333334 | 0 |
| 0.9527777777777778 | 0 |
| 0.9534722222222222 | 0 |
| 0.9541666666666666 | 0 |
| 0.9548611111111112 | 0 |
| 0.9555555555555556 | 0 |
| 0.9562499999999999 | 0 |
| 0.9569444444444444 | 0 |
| 0.9576388888888889 | 0 |
| 0.9583333333333334 | 0 |
| 0.9590277777777777 | 0 |
| 0.9597222222222223 | 0 |
| 0.9604166666666667 | 0 |
| 0.9611111111111111 | 0 |
| 0.9618055555555555 | 0 |
| 0.9625 | 0 |
| 0.9631944444444445 | 0 |
| 0.9638888888888889 | 0 |
| 0.9645833333333332 | 0 |
| 0.9652777777777778 | 0 |
| 0.9659722222222222 | 0 |
| 0.9666666666666667 | 0 |
| 0.967361111111111 | 0 |
| 0.9680555555555556 | 0 |
| 0.96875 | 0 |
| 0.9694444444444444 | 0 |
| 0.970138888888889 | 0 |
| 0.9708333333333333 | 0 |
| 0.9715277777777778 | 0 |
| 0.9722222222222222 | 0 |
| 0.9729166666666668 | 0 |
| 0.9736111111111111 | 0 |
| 0.9743055555555555 | 0 |
| 0.975 | 0 |
| 0.9756944444444445 | 0 |
| 0.9763888888888889 | 0 |
| 0.9770833333333333 | 0 |
| 0.9777777777777777 | 0 |
| 0.9784722222222223 | 0 |
| 0.9791666666666666 | 0 |
| 0.9798611111111111 | 0 |
| 0.9805555555555556 | 0 |
| 0.9812500000000001 | 0 |
| 0.9819444444444444 | 0 |
| 0.9826388888888888 | 0 |
| 0.9833333333333334 | 0 |
| 0.9840277777777778 | 0 |
| 0.9847222222222222 | 0 |
| 0.9854166666666666 | 0 |
| 0.9861111111111112 | 0 |
| 0.9868055555555556 | 0 |
| 0.9874999999999999 | 0 |
| 0.9881944444444444 | 0 |
| 0.9888888888888889 | 0 |
| 0.9895833333333334 | 0 |
| 0.9902777777777777 | 0 |
| 0.9909722222222223 | 0 |
| 0.9916666666666667 | 0 |
| 0.9923611111111111 | 0 |
| 0.9930555555555555 | 0 |
| 0.99375 | 0 |
| 0.9944444444444445 | 0 |
| 0.9951388888888889 | 0 |
| 0.9958333333333332 | 0 |
| 0.9965277777777778 | 0 |
| 0.9972222222222222 | 0 |
| 0.9979166666666667 | 0 |
| 0.998611111111111 | 0 |
| 0.9993055555555556 | 0 |